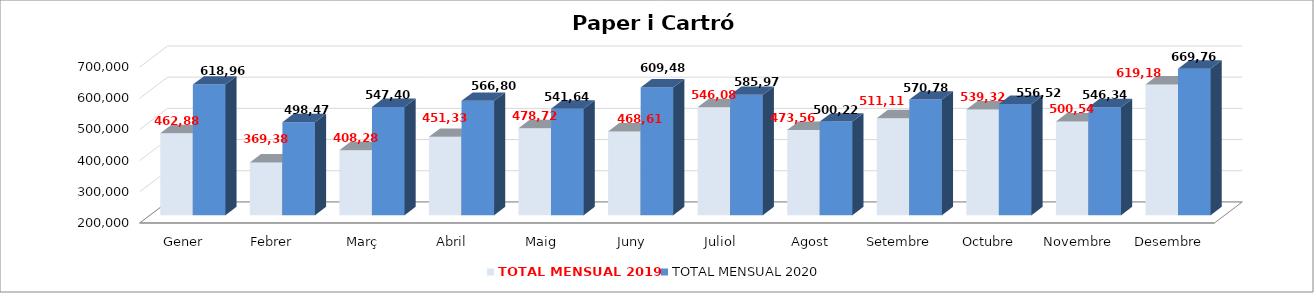
| Category | TOTAL MENSUAL 2019 | TOTAL MENSUAL 2020 |
|---|---|---|
| Gener | 462880.01 | 618960 |
| Febrer | 369380 | 498470.26 |
| Març | 408280 | 547400.02 |
| Abril | 451329.96 | 566800 |
| Maig | 478719.99 | 541640.01 |
| Juny | 468610.01 | 609488.57 |
| Juliol | 546079.96 | 585970.05 |
| Agost | 473560.01 | 500221.01 |
| Setembre | 511110 | 570779.96 |
| Octubre | 539325.01 | 556520.02 |
| Novembre | 500540.01 | 546339.99 |
| Desembre | 619179.57 | 669765.97 |